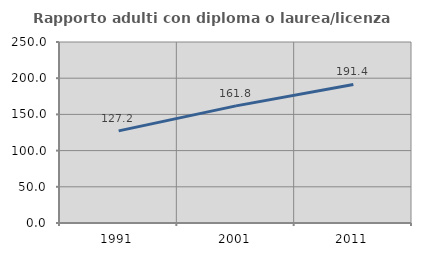
| Category | Rapporto adulti con diploma o laurea/licenza media  |
|---|---|
| 1991.0 | 127.201 |
| 2001.0 | 161.793 |
| 2011.0 | 191.351 |